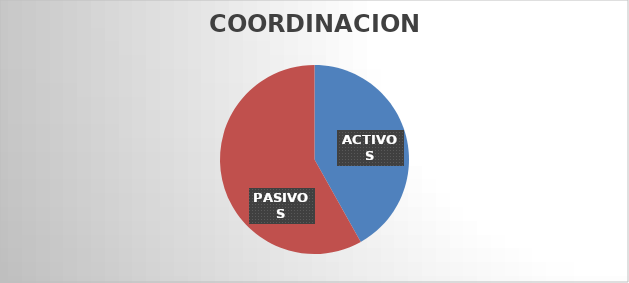
| Category | Series 0 |
|---|---|
| ACTIVOS | 18 |
| PASIVOS | 25 |